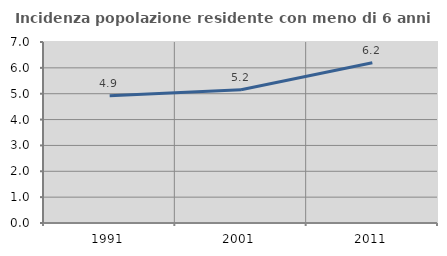
| Category | Incidenza popolazione residente con meno di 6 anni |
|---|---|
| 1991.0 | 4.926 |
| 2001.0 | 5.151 |
| 2011.0 | 6.197 |